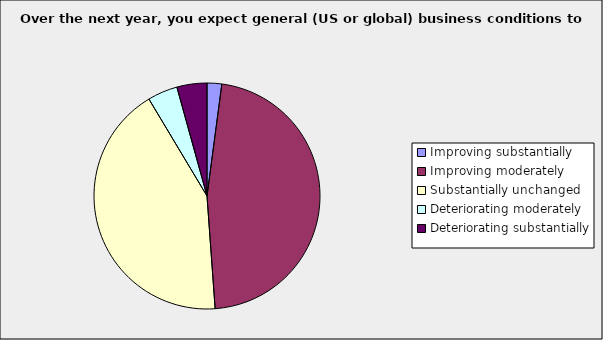
| Category | Series 0 |
|---|---|
| Improving substantially | 0.021 |
| Improving moderately | 0.468 |
| Substantially unchanged | 0.426 |
| Deteriorating moderately | 0.043 |
| Deteriorating substantially | 0.043 |